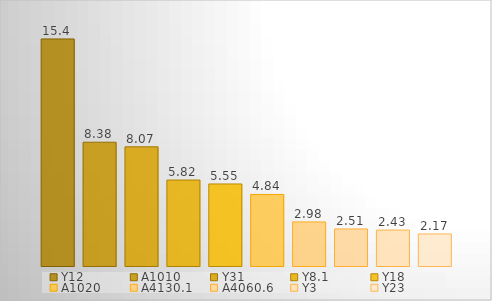
| Category | Y12 | A1010 | Y31 | Y8.1 | Y18 | A1020 | A4130.1 | A4060.6 | Y3 | Y23 |
|---|---|---|---|---|---|---|---|---|---|---|
| 0 | 15.364 | 8.376 | 8.066 | 5.817 | 5.551 | 4.841 | 2.983 | 2.507 | 2.432 | 2.168 |